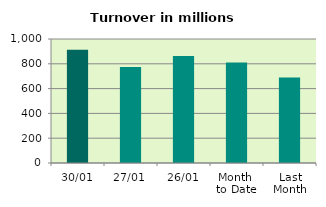
| Category | Series 0 |
|---|---|
| 30/01 | 912.307 |
| 27/01 | 773.717 |
| 26/01 | 863.704 |
| Month 
to Date | 811.438 |
| Last
Month | 689.27 |